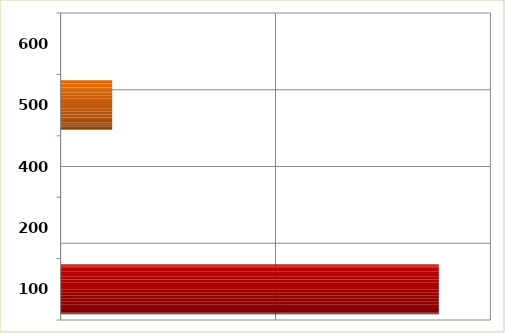
| Category | Series 0 |
|---|---|
| 100.0 | 87996019.07 |
| 200.0 | 0 |
| 400.0 | 0 |
| 500.0 | 11999999 |
| 600.0 | 0 |